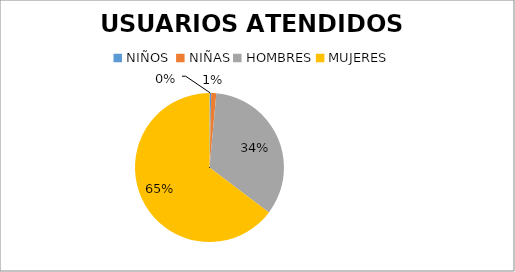
| Category | USUARIOS ATENDIDOS  PORCENTAJE | USUARIOS ATENDIDOS  CANTIDAD |
|---|---|---|
| NIÑOS  | 0.568 | 26 |
| NIÑAS | 1.705 | 13 |
| HOMBRES | 52.273 | 17 |
| MUJERES | 100 | 120 |